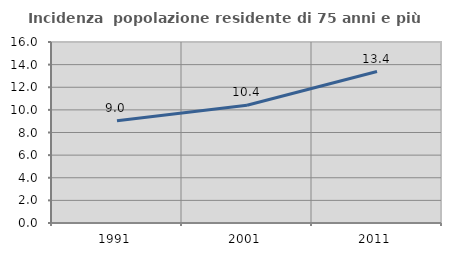
| Category | Incidenza  popolazione residente di 75 anni e più |
|---|---|
| 1991.0 | 9.035 |
| 2001.0 | 10.408 |
| 2011.0 | 13.392 |